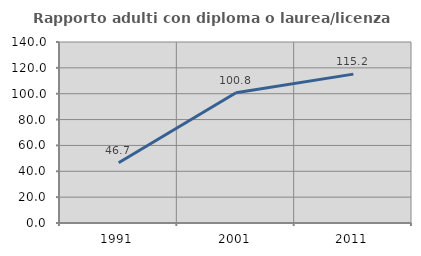
| Category | Rapporto adulti con diploma o laurea/licenza media  |
|---|---|
| 1991.0 | 46.667 |
| 2001.0 | 100.811 |
| 2011.0 | 115.152 |